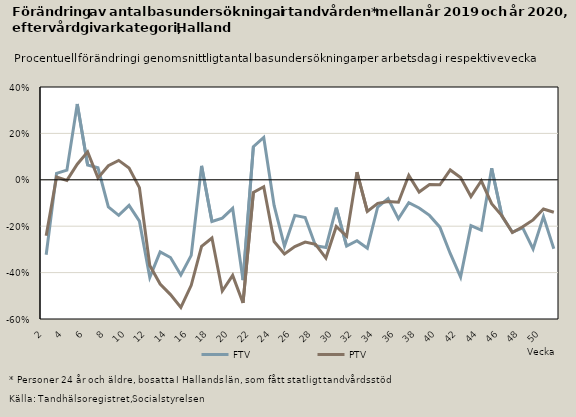
| Category | FTV | PTV |
|---|---|---|
| 2.0 | -0.323 | -0.241 |
| 3.0 | 0.028 | 0.012 |
| 4.0 | 0.041 | -0.003 |
| 5.0 | 0.327 | 0.067 |
| 6.0 | 0.064 | 0.12 |
| 7.0 | 0.052 | 0.008 |
| 8.0 | -0.117 | 0.061 |
| 9.0 | -0.153 | 0.084 |
| 10.0 | -0.11 | 0.051 |
| 11.0 | -0.178 | -0.034 |
| 12.0 | -0.421 | -0.369 |
| 13.0 | -0.311 | -0.449 |
| 14.0 | -0.335 | -0.495 |
| 15.0 | -0.41 | -0.55 |
| 16.0 | -0.326 | -0.455 |
| 17.0 | 0.06 | -0.287 |
| 18.0 | -0.18 | -0.251 |
| 19.0 | -0.165 | -0.479 |
| 20.0 | -0.123 | -0.412 |
| 21.0 | -0.433 | -0.531 |
| 22.0 | 0.143 | -0.054 |
| 23.0 | 0.182 | -0.03 |
| 24.0 | -0.11 | -0.266 |
| 25.0 | -0.286 | -0.319 |
| 26.0 | -0.153 | -0.288 |
| 27.0 | -0.163 | -0.268 |
| 28.0 | -0.284 | -0.278 |
| 29.0 | -0.292 | -0.337 |
| 30.0 | -0.12 | -0.201 |
| 31.0 | -0.286 | -0.244 |
| 32.0 | -0.263 | 0.033 |
| 33.0 | -0.295 | -0.137 |
| 34.0 | -0.117 | -0.101 |
| 35.0 | -0.081 | -0.093 |
| 36.0 | -0.168 | -0.097 |
| 37.0 | -0.099 | 0.019 |
| 38.0 | -0.121 | -0.052 |
| 39.0 | -0.153 | -0.02 |
| 40.0 | -0.204 | -0.021 |
| 41.0 | -0.317 | 0.042 |
| 42.0 | -0.419 | 0.009 |
| 43.0 | -0.197 | -0.072 |
| 44.0 | -0.217 | -0.004 |
| 45.0 | 0.05 | -0.103 |
| 46.0 | -0.158 | -0.156 |
| 47.0 | -0.226 | -0.227 |
| 48.0 | -0.207 | -0.202 |
| 49.0 | -0.298 | -0.173 |
| 50.0 | -0.159 | -0.126 |
| 51.0 | -0.297 | -0.14 |